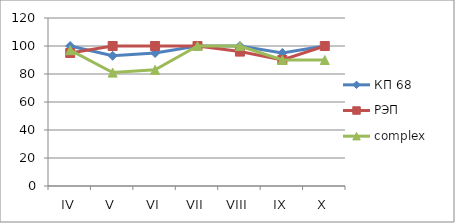
| Category | КП 68 | РЭП  | complex |
|---|---|---|---|
| IV | 100 | 95 | 97 |
| V | 93 | 100 | 81 |
| VI | 95 | 100 | 83 |
| VII | 100 | 100 | 100 |
| VIII | 100 | 96 | 100 |
| IX | 95 | 90 | 90 |
| X | 100 | 100 | 90 |